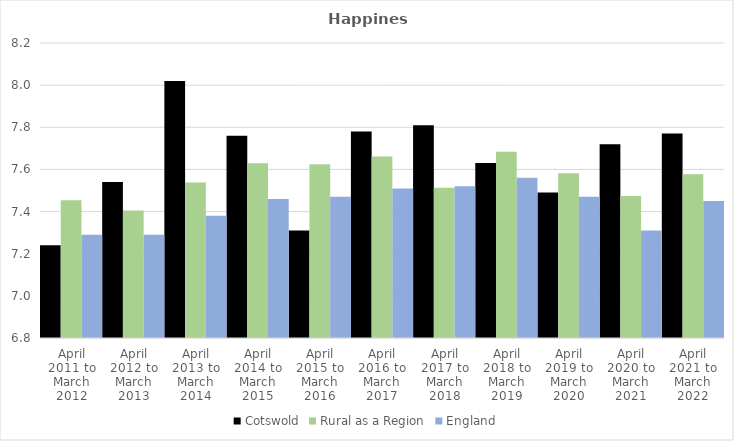
| Category | Cotswold | Rural as a Region | England |
|---|---|---|---|
| April 2011 to March 2012 | 7.24 | 7.454 | 7.29 |
| April 2012 to March 2013 | 7.54 | 7.406 | 7.29 |
| April 2013 to March 2014 | 8.02 | 7.539 | 7.38 |
| April 2014 to March 2015 | 7.76 | 7.63 | 7.46 |
| April 2015 to March 2016 | 7.31 | 7.625 | 7.47 |
| April 2016 to March 2017 | 7.78 | 7.661 | 7.51 |
| April 2017 to March 2018 | 7.81 | 7.513 | 7.52 |
| April 2018 to March 2019 | 7.63 | 7.684 | 7.56 |
| April 2019 to March 2020 | 7.49 | 7.582 | 7.47 |
| April 2020 to March 2021 | 7.72 | 7.474 | 7.31 |
| April 2021 to March 2022 | 7.77 | 7.577 | 7.45 |